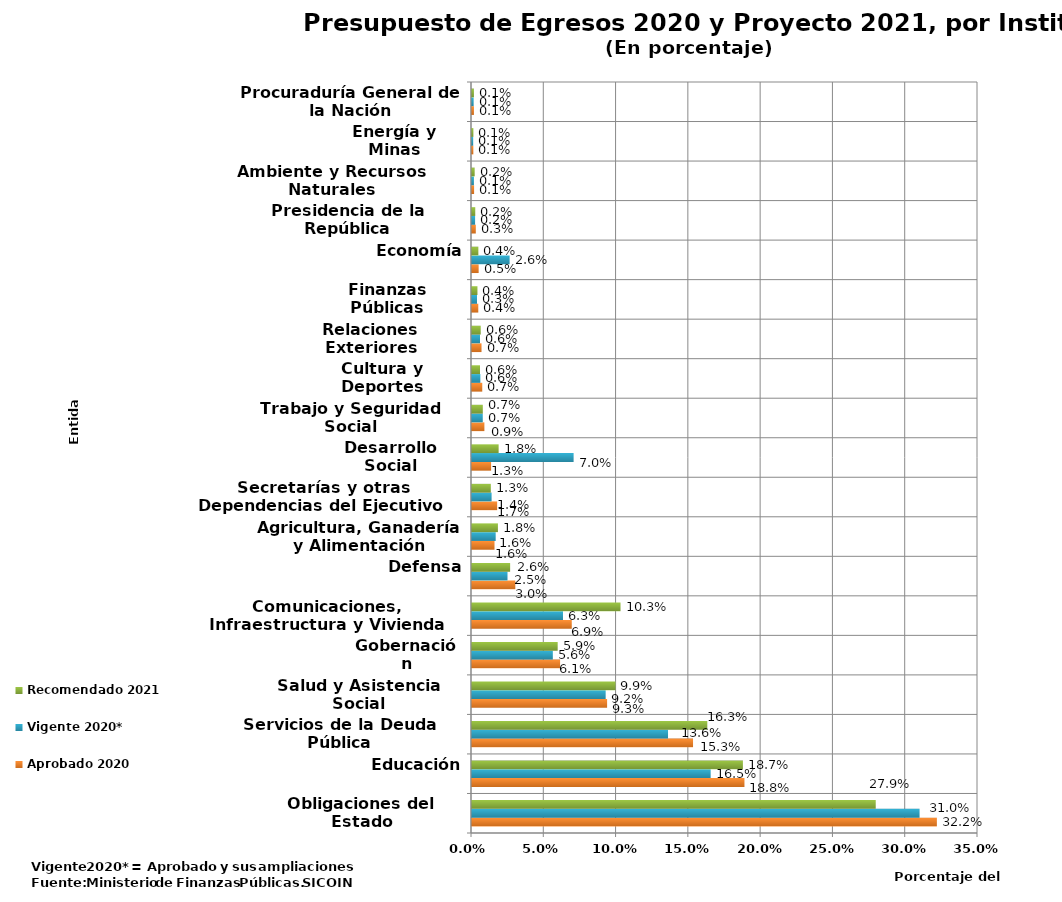
| Category | Aprobado 2020 | Vigente 2020* | Recomendado 2021 |
|---|---|---|---|
| Obligaciones del Estado | 0.322 | 0.31 | 0.279 |
| Educación | 0.188 | 0.165 | 0.187 |
| Servicios de la Deuda Pública | 0.153 | 0.136 | 0.163 |
| Salud y Asistencia Social | 0.093 | 0.092 | 0.099 |
| Gobernación | 0.061 | 0.056 | 0.059 |
| Comunicaciones, Infraestructura y Vivienda | 0.069 | 0.063 | 0.103 |
| Defensa | 0.03 | 0.025 | 0.026 |
| Agricultura, Ganadería y Alimentación | 0.016 | 0.016 | 0.018 |
| Secretarías y otras Dependencias del Ejecutivo | 0.017 | 0.014 | 0.013 |
| Desarrollo Social | 0.013 | 0.07 | 0.018 |
| Trabajo y Seguridad Social | 0.009 | 0.007 | 0.007 |
| Cultura y Deportes | 0.007 | 0.006 | 0.006 |
| Relaciones Exteriores | 0.007 | 0.006 | 0.006 |
| Finanzas Públicas | 0.004 | 0.003 | 0.004 |
| Economía | 0.005 | 0.026 | 0.004 |
| Presidencia de la República | 0.003 | 0.002 | 0.002 |
| Ambiente y Recursos Naturales | 0.001 | 0.001 | 0.002 |
| Energía y Minas | 0.001 | 0.001 | 0.001 |
| Procuraduría General de la Nación | 0.001 | 0.001 | 0.001 |